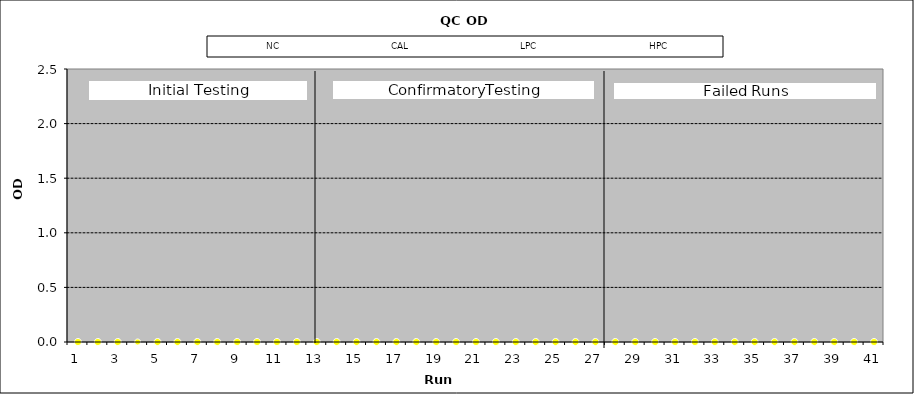
| Category | NC | CAL | LPC | HPC |
|---|---|---|---|---|
| 0 | 0 | 0 | 0 | 0 |
| 1 | 0 | 0 | 0 | 0 |
| 2 | 0 | 0 | 0 | 0 |
| 3 | 0 | 0 | 0 | 0 |
| 4 | 0 | 0 | 0 | 0 |
| 5 | 0 | 0 | 0 | 0 |
| 6 | 0 | 0 | 0 | 0 |
| 7 | 0 | 0 | 0 | 0 |
| 8 | 0 | 0 | 0 | 0 |
| 9 | 0 | 0 | 0 | 0 |
| 10 | 0 | 0 | 0 | 0 |
| 11 | 0 | 0 | 0 | 0 |
| 12 | 0 | 0 | 0 | 0 |
| 13 | 0 | 0 | 0 | 0 |
| 14 | 0 | 0 | 0 | 0 |
| 15 | 0 | 0 | 0 | 0 |
| 16 | 0 | 0 | 0 | 0 |
| 17 | 0 | 0 | 0 | 0 |
| 18 | 0 | 0 | 0 | 0 |
| 19 | 0 | 0 | 0 | 0 |
| 20 | 0 | 0 | 0 | 0 |
| 21 | 0 | 0 | 0 | 0 |
| 22 | 0 | 0 | 0 | 0 |
| 23 | 0 | 0 | 0 | 0 |
| 24 | 0 | 0 | 0 | 0 |
| 25 | 0 | 0 | 0 | 0 |
| 26 | 0 | 0 | 0 | 0 |
| 27 | 0 | 0 | 0 | 0 |
| 28 | 0 | 0 | 0 | 0 |
| 29 | 0 | 0 | 0 | 0 |
| 30 | 0 | 0 | 0 | 0 |
| 31 | 0 | 0 | 0 | 0 |
| 32 | 0 | 0 | 0 | 0 |
| 33 | 0 | 0 | 0 | 0 |
| 34 | 0 | 0 | 0 | 0 |
| 35 | 0 | 0 | 0 | 0 |
| 36 | 0 | 0 | 0 | 0 |
| 37 | 0 | 0 | 0 | 0 |
| 38 | 0 | 0 | 0 | 0 |
| 39 | 0 | 0 | 0 | 0 |
| 40 | 0 | 0 | 0 | 0 |